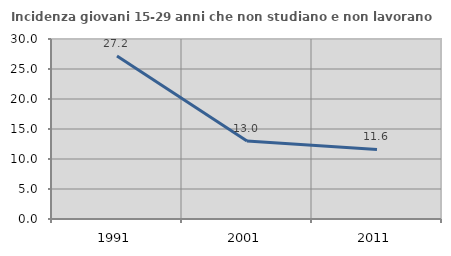
| Category | Incidenza giovani 15-29 anni che non studiano e non lavorano  |
|---|---|
| 1991.0 | 27.16 |
| 2001.0 | 12.981 |
| 2011.0 | 11.602 |